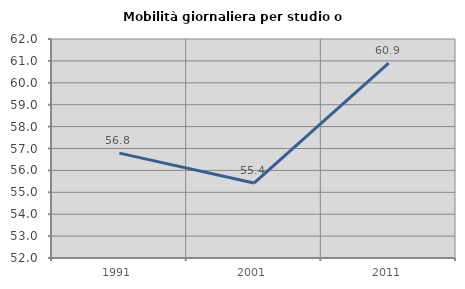
| Category | Mobilità giornaliera per studio o lavoro |
|---|---|
| 1991.0 | 56.788 |
| 2001.0 | 55.421 |
| 2011.0 | 60.899 |